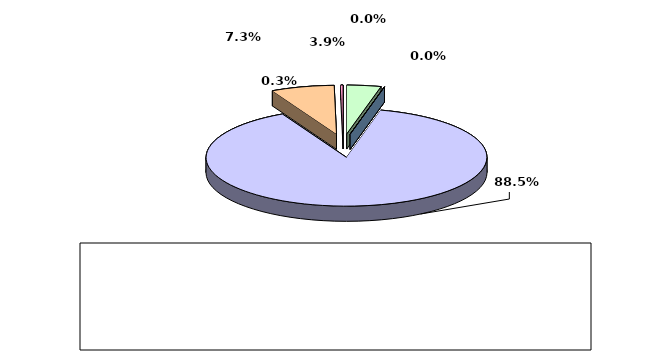
| Category | Series 0 |
|---|---|
| מזומנים ושווי מזומנים | 0.039 |
| אג"ח ממשלתיות סחירות | 0 |
| אג"ח קונצרני סחיר | 0 |
| ני"ע אחרים סחירים | 0.885 |
| פקדונות והלוואות | 0.073 |
| השקעות אחרות | 0.003 |